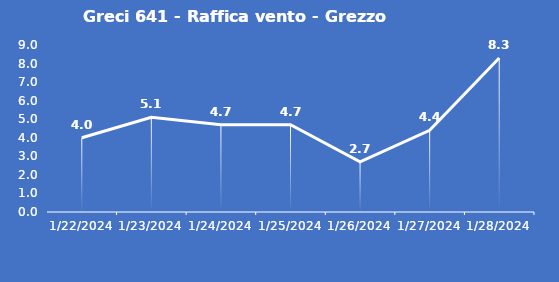
| Category | Greci 641 - Raffica vento - Grezzo (m/s) |
|---|---|
| 1/22/24 | 4 |
| 1/23/24 | 5.1 |
| 1/24/24 | 4.7 |
| 1/25/24 | 4.7 |
| 1/26/24 | 2.7 |
| 1/27/24 | 4.4 |
| 1/28/24 | 8.3 |